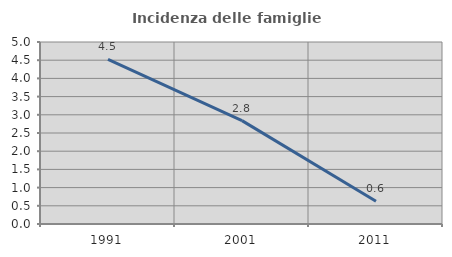
| Category | Incidenza delle famiglie numerose |
|---|---|
| 1991.0 | 4.523 |
| 2001.0 | 2.841 |
| 2011.0 | 0.625 |